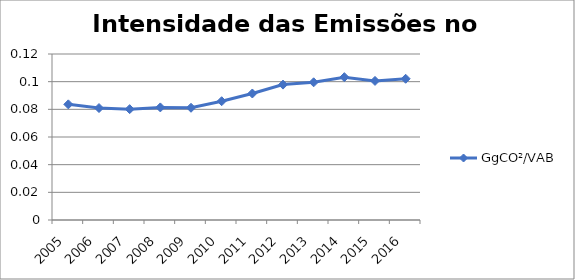
| Category | GgCO²/VAB |
|---|---|
| 2005.0 | 0.084 |
| 2006.0 | 0.081 |
| 2007.0 | 0.08 |
| 2008.0 | 0.081 |
| 2009.0 | 0.081 |
| 2010.0 | 0.086 |
| 2011.0 | 0.091 |
| 2012.0 | 0.098 |
| 2013.0 | 0.1 |
| 2014.0 | 0.103 |
| 2015.0 | 0.101 |
| 2016.0 | 0.102 |